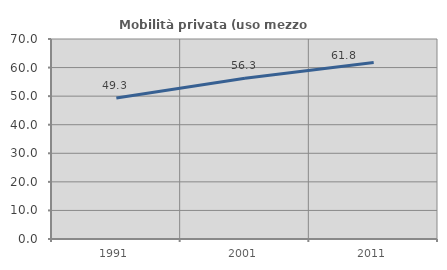
| Category | Mobilità privata (uso mezzo privato) |
|---|---|
| 1991.0 | 49.318 |
| 2001.0 | 56.25 |
| 2011.0 | 61.794 |